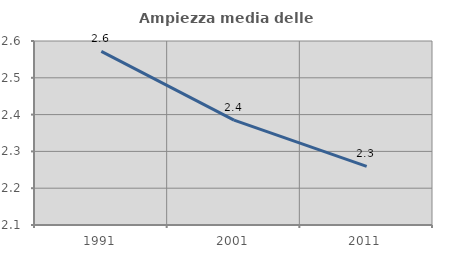
| Category | Ampiezza media delle famiglie |
|---|---|
| 1991.0 | 2.572 |
| 2001.0 | 2.385 |
| 2011.0 | 2.259 |